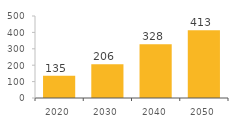
| Category | ON |
|---|---|
| 2020.0 | 135.244 |
| 2030.0 | 205.969 |
| 2040.0 | 327.948 |
| 2050.0 | 413.415 |